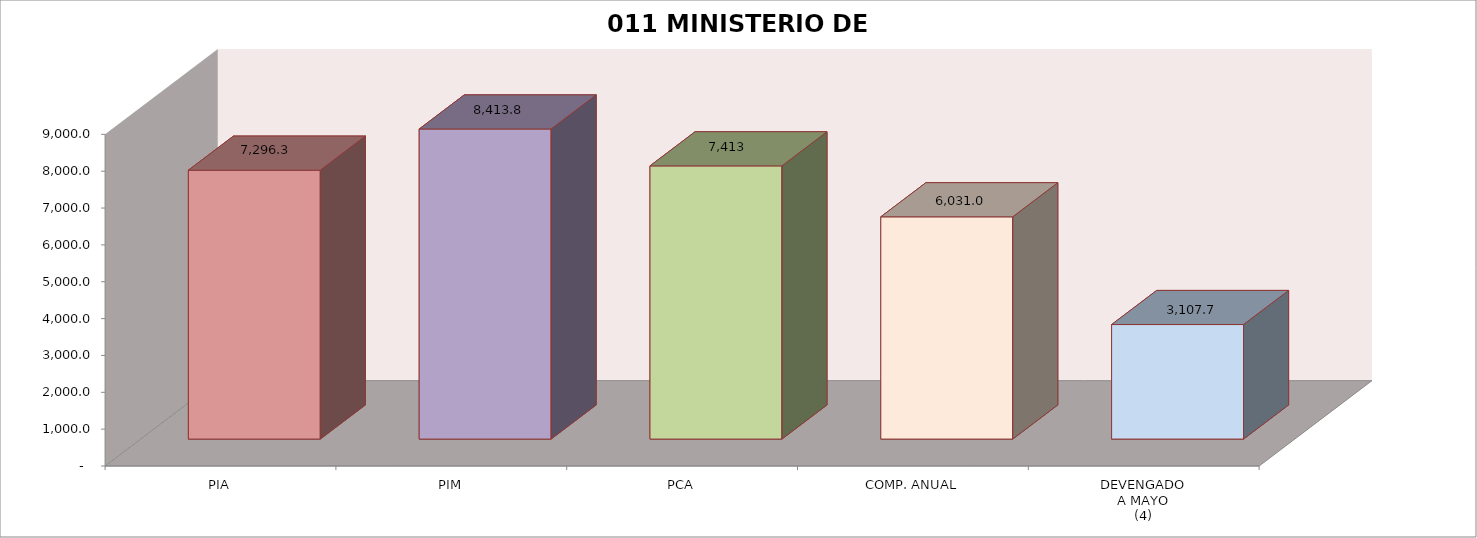
| Category | 011 MINISTERIO DE SALUD |
|---|---|
| PIA | 7296.309 |
| PIM | 8413.849 |
| PCA | 7413.408 |
| COMP. ANUAL | 6030.978 |
| DEVENGADO
A MAYO
(4) | 3107.71 |